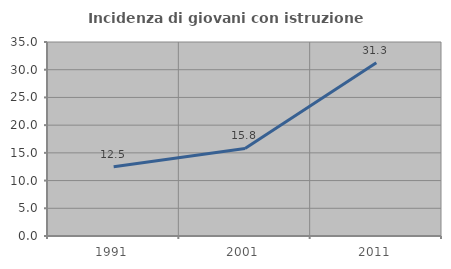
| Category | Incidenza di giovani con istruzione universitaria |
|---|---|
| 1991.0 | 12.5 |
| 2001.0 | 15.789 |
| 2011.0 | 31.25 |